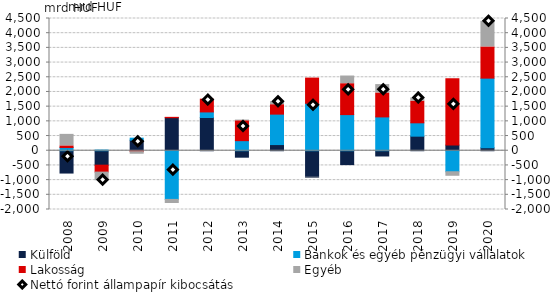
| Category | Külföld | Bankok és egyéb pénzügyi vállalatok | Lakosság | Egyéb |
|---|---|---|---|---|
| 2008.0 | -759.65 | 107.753 | 57.047 | 392.2 |
| 2009.0 | -491.4 | 23.556 | -236.156 | -293.241 |
| 2010.0 | 358.869 | 68.381 | -32.221 | -87.487 |
| 2011.0 | 1124.084 | -1656.51 | 11.985 | -139.476 |
| 2012.0 | 1130.805 | 189.835 | 433.858 | -29.175 |
| 2013.0 | -219.704 | 342.911 | 675.773 | 24.837 |
| 2014.0 | 209.723 | 1035.767 | 320.976 | 103.968 |
| 2015.0 | -901.505 | 1614.165 | 857.987 | -21.991 |
| 2016.0 | -472.926 | 1229.477 | 1051.766 | 261.126 |
| 2017.0 | -178.442 | 1151.054 | 813.833 | 286.152 |
| 2018.0 | 495.617 | 454.277 | 738.786 | 106.873 |
| 2019.0 | 191.548 | -715.328 | 2258.343 | -154.373 |
| 2020.0 | 98.531 | 2372.071 | 1061.422 | 872.128 |